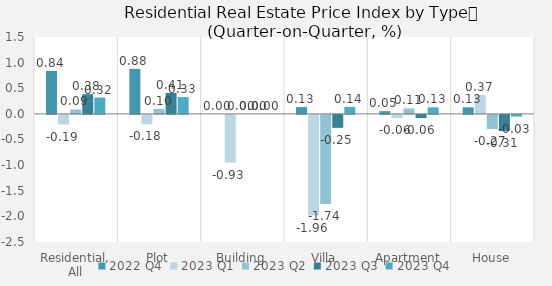
| Category | 2022 | 2023 |
|---|---|---|
| Residential, All | 0.839 | 0.319 |
| Plot | 0.879 | 0.328 |
| Building | 0 | 0 |
| Villa | 0.132 | 0.136 |
| Apartment | 0.053 | 0.128 |
| House | 0.128 | -0.033 |